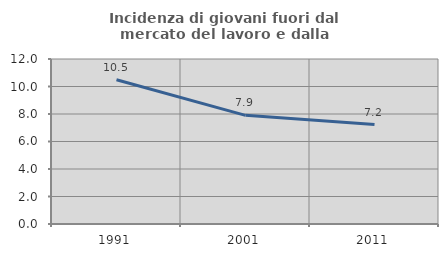
| Category | Incidenza di giovani fuori dal mercato del lavoro e dalla formazione  |
|---|---|
| 1991.0 | 10.49 |
| 2001.0 | 7.904 |
| 2011.0 | 7.233 |